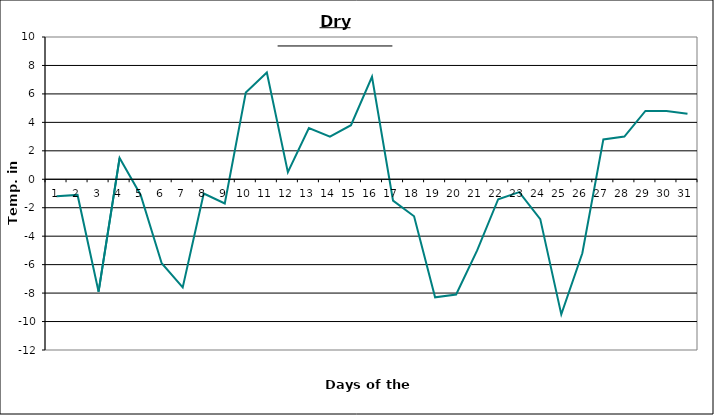
| Category | Series 0 |
|---|---|
| 0 | -1.2 |
| 1 | -1.1 |
| 2 | -7.9 |
| 3 | 1.5 |
| 4 | -1.1 |
| 5 | -5.9 |
| 6 | -7.6 |
| 7 | -1 |
| 8 | -1.7 |
| 9 | 6.1 |
| 10 | 7.5 |
| 11 | 0.5 |
| 12 | 3.6 |
| 13 | 3 |
| 14 | 3.8 |
| 15 | 7.2 |
| 16 | -1.5 |
| 17 | -2.6 |
| 18 | -8.3 |
| 19 | -8.1 |
| 20 | -5 |
| 21 | -1.4 |
| 22 | -0.9 |
| 23 | -2.8 |
| 24 | -9.5 |
| 25 | -5.2 |
| 26 | 2.8 |
| 27 | 3 |
| 28 | 4.8 |
| 29 | 4.8 |
| 30 | 4.6 |